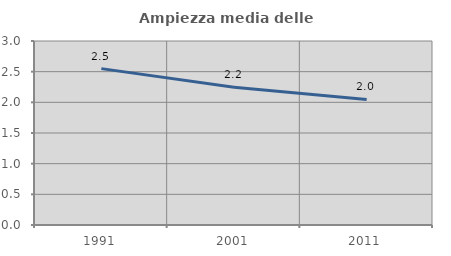
| Category | Ampiezza media delle famiglie |
|---|---|
| 1991.0 | 2.55 |
| 2001.0 | 2.247 |
| 2011.0 | 2.047 |